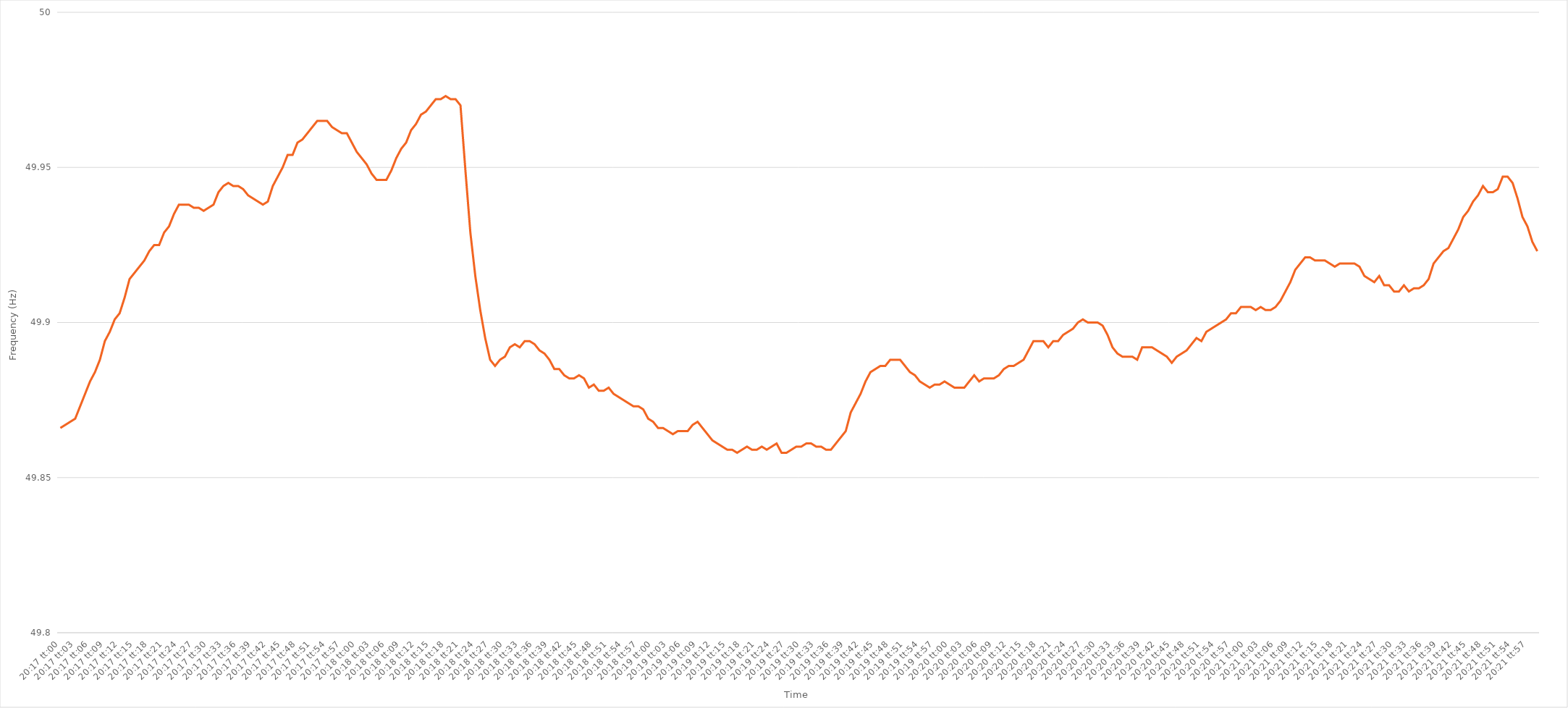
| Category | Series 0 |
|---|---|
| 0.845138888888889 | 49.866 |
| 0.8451504629629629 | 49.867 |
| 0.8451620370370371 | 49.868 |
| 0.8451736111111111 | 49.869 |
| 0.8451851851851852 | 49.873 |
| 0.8451967592592592 | 49.877 |
| 0.8452083333333333 | 49.881 |
| 0.8452199074074075 | 49.884 |
| 0.8452314814814814 | 49.888 |
| 0.8452430555555556 | 49.894 |
| 0.8452546296296296 | 49.897 |
| 0.8452662037037038 | 49.901 |
| 0.8452777777777777 | 49.903 |
| 0.8452893518518518 | 49.908 |
| 0.845300925925926 | 49.914 |
| 0.8453125 | 49.916 |
| 0.8453240740740741 | 49.918 |
| 0.8453356481481481 | 49.92 |
| 0.8453472222222222 | 49.923 |
| 0.8453587962962964 | 49.925 |
| 0.8453703703703703 | 49.925 |
| 0.8453819444444445 | 49.929 |
| 0.8453935185185185 | 49.931 |
| 0.8454050925925927 | 49.935 |
| 0.8454166666666666 | 49.938 |
| 0.8454282407407407 | 49.938 |
| 0.8454398148148149 | 49.938 |
| 0.8454513888888888 | 49.937 |
| 0.845462962962963 | 49.937 |
| 0.845474537037037 | 49.936 |
| 0.8454861111111112 | 49.937 |
| 0.8454976851851851 | 49.938 |
| 0.8455092592592592 | 49.942 |
| 0.8455208333333334 | 49.944 |
| 0.8455324074074074 | 49.945 |
| 0.8455439814814815 | 49.944 |
| 0.8455555555555555 | 49.944 |
| 0.8455671296296297 | 49.943 |
| 0.8455787037037038 | 49.941 |
| 0.8455902777777777 | 49.94 |
| 0.8456018518518519 | 49.939 |
| 0.8456134259259259 | 49.938 |
| 0.8456250000000001 | 49.939 |
| 0.845636574074074 | 49.944 |
| 0.8456481481481481 | 49.947 |
| 0.8456597222222223 | 49.95 |
| 0.8456712962962962 | 49.954 |
| 0.8456828703703704 | 49.954 |
| 0.8456944444444444 | 49.958 |
| 0.8457060185185186 | 49.959 |
| 0.8457175925925925 | 49.961 |
| 0.8457291666666666 | 49.963 |
| 0.8457407407407408 | 49.965 |
| 0.8457523148148148 | 49.965 |
| 0.8457638888888889 | 49.965 |
| 0.8457754629629629 | 49.963 |
| 0.8457870370370371 | 49.962 |
| 0.8457986111111112 | 49.961 |
| 0.8458101851851851 | 49.961 |
| 0.8458217592592593 | 49.958 |
| 0.8458333333333333 | 49.955 |
| 0.8458449074074075 | 49.953 |
| 0.8458564814814814 | 49.951 |
| 0.8458680555555556 | 49.948 |
| 0.8458796296296297 | 49.946 |
| 0.8458912037037036 | 49.946 |
| 0.8459027777777778 | 49.946 |
| 0.8459143518518518 | 49.949 |
| 0.845925925925926 | 49.953 |
| 0.8459374999999999 | 49.956 |
| 0.845949074074074 | 49.958 |
| 0.8459606481481482 | 49.962 |
| 0.8459722222222222 | 49.964 |
| 0.8459837962962963 | 49.967 |
| 0.8459953703703703 | 49.968 |
| 0.8460069444444445 | 49.97 |
| 0.8460185185185186 | 49.972 |
| 0.8460300925925925 | 49.972 |
| 0.8460416666666667 | 49.973 |
| 0.8460532407407407 | 49.972 |
| 0.8460648148148149 | 49.972 |
| 0.8460763888888888 | 49.97 |
| 0.846087962962963 | 49.949 |
| 0.8460995370370371 | 49.929 |
| 0.846111111111111 | 49.915 |
| 0.8461226851851852 | 49.904 |
| 0.8461342592592592 | 49.895 |
| 0.8461458333333334 | 49.888 |
| 0.8461574074074073 | 49.886 |
| 0.8461689814814815 | 49.888 |
| 0.8461805555555556 | 49.889 |
| 0.8461921296296296 | 49.892 |
| 0.8462037037037037 | 49.893 |
| 0.8462152777777777 | 49.892 |
| 0.8462268518518519 | 49.894 |
| 0.846238425925926 | 49.894 |
| 0.84625 | 49.893 |
| 0.8462615740740741 | 49.891 |
| 0.8462731481481481 | 49.89 |
| 0.8462847222222223 | 49.888 |
| 0.8462962962962962 | 49.885 |
| 0.8463078703703704 | 49.885 |
| 0.8463194444444445 | 49.883 |
| 0.8463310185185186 | 49.882 |
| 0.8463425925925926 | 49.882 |
| 0.8463541666666666 | 49.883 |
| 0.8463657407407408 | 49.882 |
| 0.8463773148148147 | 49.879 |
| 0.8463888888888889 | 49.88 |
| 0.846400462962963 | 49.878 |
| 0.846412037037037 | 49.878 |
| 0.8464236111111111 | 49.879 |
| 0.8464351851851851 | 49.877 |
| 0.8464467592592593 | 49.876 |
| 0.8464583333333334 | 49.875 |
| 0.8464699074074074 | 49.874 |
| 0.8464814814814815 | 49.873 |
| 0.8464930555555555 | 49.873 |
| 0.8465046296296297 | 49.872 |
| 0.8465162037037036 | 49.869 |
| 0.8465277777777778 | 49.868 |
| 0.8465393518518519 | 49.866 |
| 0.846550925925926 | 49.866 |
| 0.8465625 | 49.865 |
| 0.846574074074074 | 49.864 |
| 0.8465856481481482 | 49.865 |
| 0.8465972222222223 | 49.865 |
| 0.8466087962962963 | 49.865 |
| 0.8466203703703704 | 49.867 |
| 0.8466319444444445 | 49.868 |
| 0.8466435185185185 | 49.866 |
| 0.8466550925925925 | 49.864 |
| 0.8466666666666667 | 49.862 |
| 0.8466782407407408 | 49.861 |
| 0.8466898148148148 | 49.86 |
| 0.8467013888888889 | 49.859 |
| 0.846712962962963 | 49.859 |
| 0.8467245370370371 | 49.858 |
| 0.846736111111111 | 49.859 |
| 0.8467476851851852 | 49.86 |
| 0.8467592592592593 | 49.859 |
| 0.8467708333333334 | 49.859 |
| 0.8467824074074074 | 49.86 |
| 0.8467939814814814 | 49.859 |
| 0.8468055555555556 | 49.86 |
| 0.8468171296296297 | 49.861 |
| 0.8468287037037037 | 49.858 |
| 0.8468402777777778 | 49.858 |
| 0.8468518518518519 | 49.859 |
| 0.8468634259259259 | 49.86 |
| 0.8468749999999999 | 49.86 |
| 0.8468865740740741 | 49.861 |
| 0.8468981481481482 | 49.861 |
| 0.8469097222222222 | 49.86 |
| 0.8469212962962963 | 49.86 |
| 0.8469328703703703 | 49.859 |
| 0.8469444444444445 | 49.859 |
| 0.8469560185185184 | 49.861 |
| 0.8469675925925926 | 49.863 |
| 0.8469791666666667 | 49.865 |
| 0.8469907407407408 | 49.871 |
| 0.8470023148148148 | 49.874 |
| 0.8470138888888888 | 49.877 |
| 0.847025462962963 | 49.881 |
| 0.8470370370370371 | 49.884 |
| 0.8470486111111111 | 49.885 |
| 0.8470601851851852 | 49.886 |
| 0.8470717592592593 | 49.886 |
| 0.8470833333333333 | 49.888 |
| 0.8470949074074073 | 49.888 |
| 0.8471064814814815 | 49.888 |
| 0.8471180555555556 | 49.886 |
| 0.8471296296296296 | 49.884 |
| 0.8471412037037037 | 49.883 |
| 0.8471527777777778 | 49.881 |
| 0.8471643518518519 | 49.88 |
| 0.8471759259259258 | 49.879 |
| 0.8471875 | 49.88 |
| 0.8471990740740741 | 49.88 |
| 0.8472106481481482 | 49.881 |
| 0.8472222222222222 | 49.88 |
| 0.8472337962962962 | 49.879 |
| 0.8472453703703704 | 49.879 |
| 0.8472569444444445 | 49.879 |
| 0.8472685185185185 | 49.881 |
| 0.8472800925925926 | 49.883 |
| 0.8472916666666667 | 49.881 |
| 0.8473032407407407 | 49.882 |
| 0.8473148148148147 | 49.882 |
| 0.8473263888888889 | 49.882 |
| 0.847337962962963 | 49.883 |
| 0.847349537037037 | 49.885 |
| 0.8473611111111111 | 49.886 |
| 0.8473726851851852 | 49.886 |
| 0.8473842592592593 | 49.887 |
| 0.8473958333333332 | 49.888 |
| 0.8474074074074074 | 49.891 |
| 0.8474189814814815 | 49.894 |
| 0.8474305555555556 | 49.894 |
| 0.8474421296296296 | 49.894 |
| 0.8474537037037037 | 49.892 |
| 0.8474652777777778 | 49.894 |
| 0.847476851851852 | 49.894 |
| 0.8474884259259259 | 49.896 |
| 0.8475 | 49.897 |
| 0.8475115740740741 | 49.898 |
| 0.8475231481481482 | 49.9 |
| 0.8475347222222221 | 49.901 |
| 0.8475462962962963 | 49.9 |
| 0.8475578703703704 | 49.9 |
| 0.8475694444444444 | 49.9 |
| 0.8475810185185185 | 49.899 |
| 0.8475925925925926 | 49.896 |
| 0.8476041666666667 | 49.892 |
| 0.8476157407407406 | 49.89 |
| 0.8476273148148148 | 49.889 |
| 0.8476388888888889 | 49.889 |
| 0.847650462962963 | 49.889 |
| 0.847662037037037 | 49.888 |
| 0.8476736111111111 | 49.892 |
| 0.8476851851851852 | 49.892 |
| 0.8476967592592594 | 49.892 |
| 0.8477083333333333 | 49.891 |
| 0.8477199074074074 | 49.89 |
| 0.8477314814814815 | 49.889 |
| 0.8477430555555556 | 49.887 |
| 0.8477546296296296 | 49.889 |
| 0.8477662037037037 | 49.89 |
| 0.8477777777777779 | 49.891 |
| 0.8477893518518518 | 49.893 |
| 0.8478009259259259 | 49.895 |
| 0.8478125 | 49.894 |
| 0.8478240740740741 | 49.897 |
| 0.847835648148148 | 49.898 |
| 0.8478472222222222 | 49.899 |
| 0.8478587962962963 | 49.9 |
| 0.8478703703703704 | 49.901 |
| 0.8478819444444444 | 49.903 |
| 0.8478935185185185 | 49.903 |
| 0.8479050925925926 | 49.905 |
| 0.8479166666666668 | 49.905 |
| 0.8479282407407407 | 49.905 |
| 0.8479398148148148 | 49.904 |
| 0.8479513888888889 | 49.905 |
| 0.847962962962963 | 49.904 |
| 0.847974537037037 | 49.904 |
| 0.8479861111111111 | 49.905 |
| 0.8479976851851853 | 49.907 |
| 0.8480092592592593 | 49.91 |
| 0.8480208333333333 | 49.913 |
| 0.8480324074074074 | 49.917 |
| 0.8480439814814815 | 49.919 |
| 0.8480555555555555 | 49.921 |
| 0.8480671296296296 | 49.921 |
| 0.8480787037037038 | 49.92 |
| 0.8480902777777778 | 49.92 |
| 0.8481018518518518 | 49.92 |
| 0.8481134259259259 | 49.919 |
| 0.848125 | 49.918 |
| 0.8481365740740742 | 49.919 |
| 0.8481481481481481 | 49.919 |
| 0.8481597222222222 | 49.919 |
| 0.8481712962962963 | 49.919 |
| 0.8481828703703704 | 49.918 |
| 0.8481944444444444 | 49.915 |
| 0.8482060185185185 | 49.914 |
| 0.8482175925925927 | 49.913 |
| 0.8482291666666667 | 49.915 |
| 0.8482407407407407 | 49.912 |
| 0.8482523148148148 | 49.912 |
| 0.8482638888888889 | 49.91 |
| 0.8482754629629629 | 49.91 |
| 0.848287037037037 | 49.912 |
| 0.8482986111111112 | 49.91 |
| 0.8483101851851852 | 49.911 |
| 0.8483217592592592 | 49.911 |
| 0.8483333333333333 | 49.912 |
| 0.8483449074074074 | 49.914 |
| 0.8483564814814816 | 49.919 |
| 0.8483680555555555 | 49.921 |
| 0.8483796296296297 | 49.923 |
| 0.8483912037037037 | 49.924 |
| 0.8484027777777778 | 49.927 |
| 0.8484143518518518 | 49.93 |
| 0.8484259259259259 | 49.934 |
| 0.8484375000000001 | 49.936 |
| 0.8484490740740741 | 49.939 |
| 0.8484606481481481 | 49.941 |
| 0.8484722222222222 | 49.944 |
| 0.8484837962962963 | 49.942 |
| 0.8484953703703703 | 49.942 |
| 0.8485069444444444 | 49.943 |
| 0.8485185185185186 | 49.947 |
| 0.8485300925925926 | 49.947 |
| 0.8485416666666666 | 49.945 |
| 0.8485532407407407 | 49.94 |
| 0.8485648148148148 | 49.934 |
| 0.848576388888889 | 49.931 |
| 0.8485879629629629 | 49.926 |
| 0.848599537037037 | 49.923 |